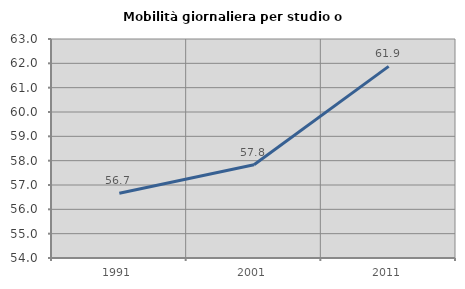
| Category | Mobilità giornaliera per studio o lavoro |
|---|---|
| 1991.0 | 56.662 |
| 2001.0 | 57.831 |
| 2011.0 | 61.874 |